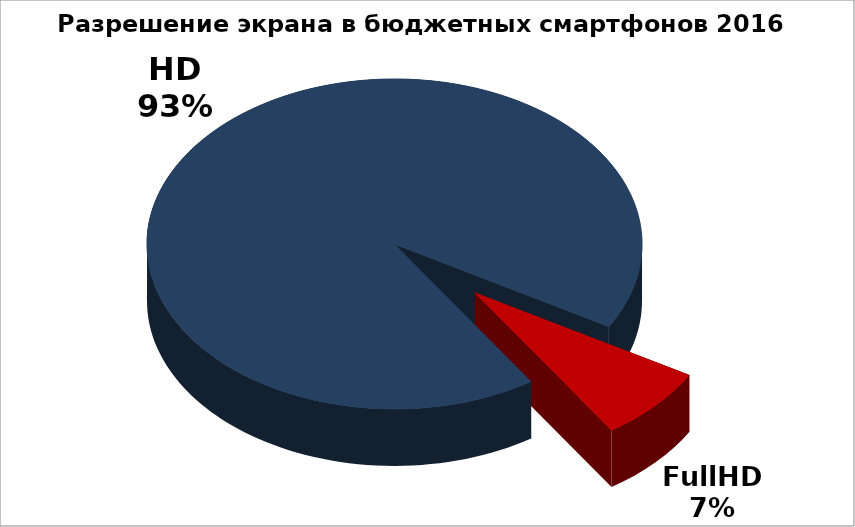
| Category | Series 0 |
|---|---|
| FullHD | 12 |
| HD | 151 |